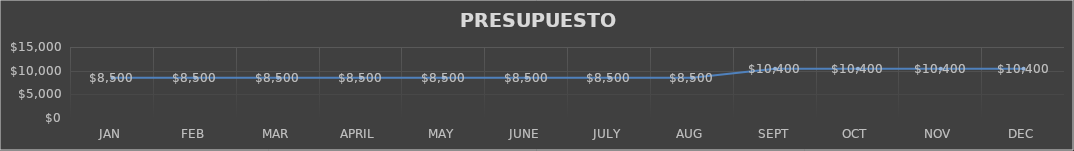
| Category | Series 0 |
|---|---|
| JAN | 8500 |
| FEB | 8500 |
| MAR | 8500 |
| APRIL | 8500 |
| MAY | 8500 |
| JUNE | 8500 |
| JULY | 8500 |
| AUG | 8500 |
| SEPT | 10400 |
| OCT | 10400 |
| NOV | 10400 |
| DEC | 10400 |